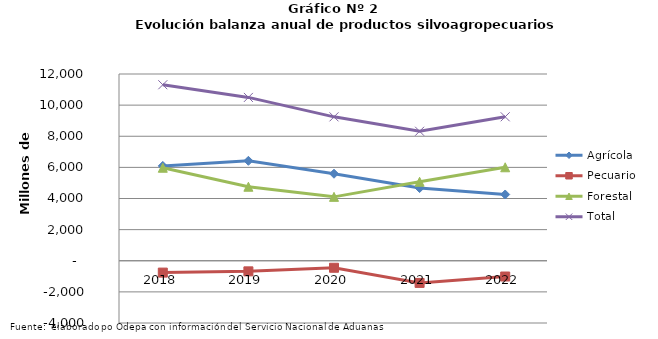
| Category | Agrícola | Pecuario | Forestal | Total |
|---|---|---|---|---|
| 2018.0 | 6094343 | -761998 | 5976134 | 11308479 |
| 2019.0 | 6422120 | -681646 | 4755333 | 10495807 |
| 2020.0 | 5590965 | -450130 | 4105622 | 9246457 |
| 2021.0 | 4670677 | -1424834 | 5074644 | 8320487 |
| 2022.0 | 4257611 | -1013499 | 6006164 | 9250276 |